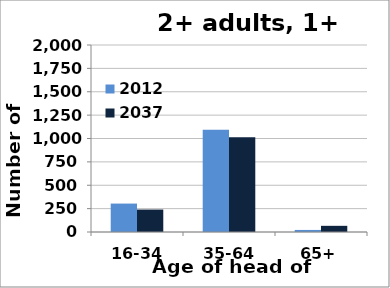
| Category | 2012 | 2037 |
|---|---|---|
| 16-34 | 304 | 240 |
| 35-64 | 1094 | 1013 |
| 65+ | 22 | 66 |